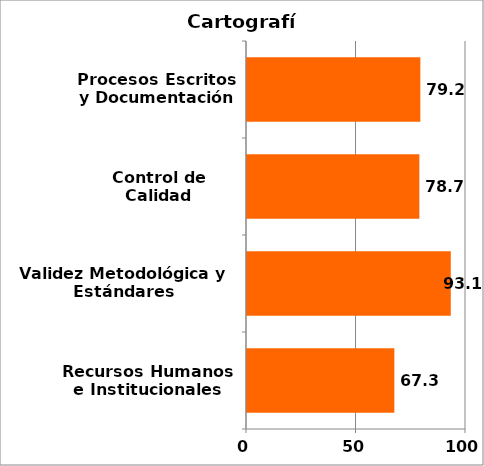
| Category | Series 0 |
|---|---|
| Recursos Humanos e Institucionales | 67.284 |
| Validez Metodológica y Estándares Internacionales | 93.056 |
| Control de Calidad | 78.704 |
| Procesos Escritos y Documentación | 79.167 |